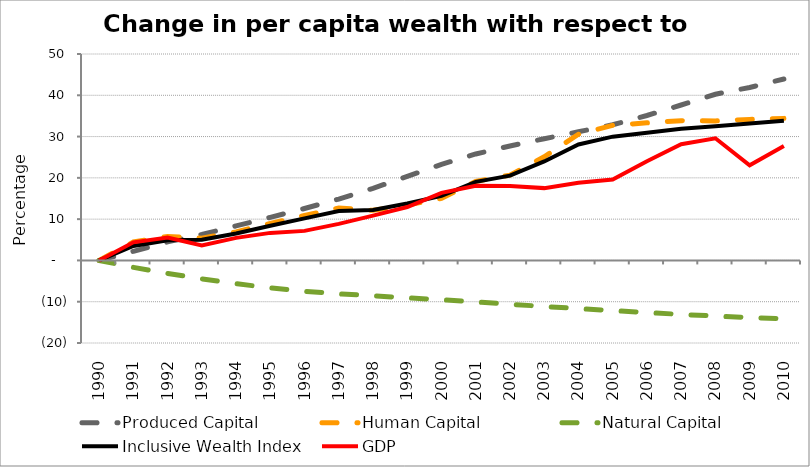
| Category | Produced Capital  | Human Capital | Natural Capital | Inclusive Wealth Index | GDP |
|---|---|---|---|---|---|
| 1990.0 | 0 | 0 | 0 | 0 | 0 |
| 1991.0 | 2.202 | 4.464 | -1.678 | 3.506 | 4.377 |
| 1992.0 | 4.481 | 5.799 | -3.152 | 4.908 | 5.537 |
| 1993.0 | 6.296 | 5.375 | -4.454 | 5.002 | 3.649 |
| 1994.0 | 8.354 | 6.92 | -5.63 | 6.51 | 5.469 |
| 1995.0 | 10.434 | 8.976 | -6.647 | 8.382 | 6.67 |
| 1996.0 | 12.575 | 10.886 | -7.467 | 10.181 | 7.159 |
| 1997.0 | 14.87 | 12.704 | -8.098 | 11.97 | 8.854 |
| 1998.0 | 17.476 | 12.134 | -8.564 | 12.219 | 10.848 |
| 1999.0 | 20.346 | 13.397 | -9.061 | 13.783 | 12.934 |
| 2000.0 | 23.275 | 15.038 | -9.534 | 15.623 | 16.377 |
| 2001.0 | 25.789 | 19.125 | -10.06 | 19.022 | 18.088 |
| 2002.0 | 27.72 | 20.671 | -10.619 | 20.536 | 18.032 |
| 2003.0 | 29.475 | 25.094 | -11.147 | 23.97 | 17.515 |
| 2004.0 | 31.157 | 30.553 | -11.667 | 28.095 | 18.821 |
| 2005.0 | 32.861 | 32.717 | -12.148 | 29.977 | 19.611 |
| 2006.0 | 35.106 | 33.327 | -12.633 | 30.937 | 24.043 |
| 2007.0 | 37.643 | 33.82 | -13.077 | 31.894 | 28.129 |
| 2008.0 | 40.249 | 33.793 | -13.478 | 32.517 | 29.582 |
| 2009.0 | 41.899 | 34.154 | -13.826 | 33.164 | 23.042 |
| 2010.0 | 43.938 | 34.407 | -14.17 | 33.837 | 27.742 |